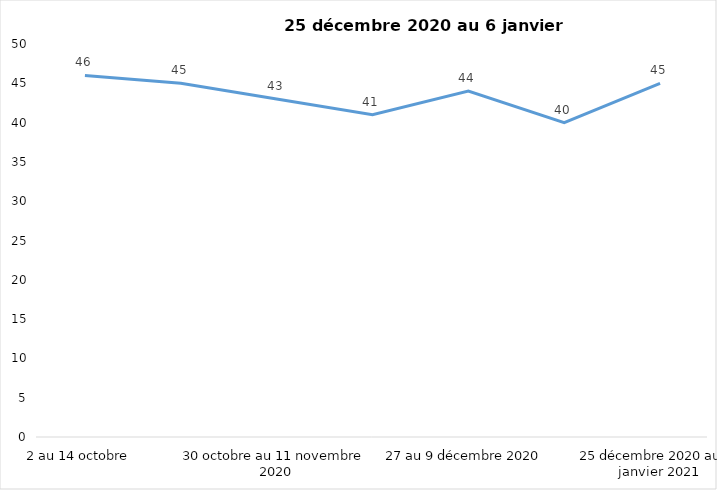
| Category | Toujours aux trois mesures |
|---|---|
| 2 au 14 octobre  | 46 |
| 16 au 28 octobre 2020 | 45 |
| 30 octobre au 11 novembre 2020 | 43 |
| 13 au 25 novembre 2020 | 41 |
| 27 au 9 décembre 2020 | 44 |
| 11 au 25 décembre 2020 | 40 |
| 25 décembre 2020 au 6 janvier 2021 | 45 |